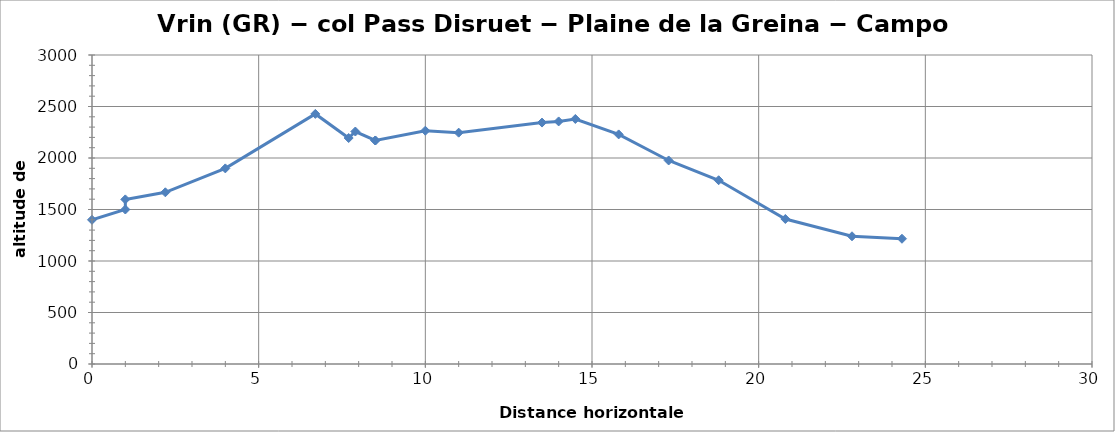
| Category | Vrin (GR) − col Pass Disruet − Plaine de la Greina − Campo (Blenio) |
|---|---|
| 0.0 | 1400 |
| 1.0 | 1500 |
| 1.0 | 1598 |
| 2.2 | 1667 |
| 4.0 | 1899 |
| 6.7 | 2428 |
| 7.7 | 2194 |
| 7.9 | 2257 |
| 8.5 | 2170 |
| 8.5 | 2170 |
| 10.0 | 2265 |
| 11.0 | 2246 |
| 13.5 | 2344 |
| 14.0 | 2355 |
| 14.5 | 2379 |
| 15.8 | 2229 |
| 17.3 | 1976 |
| 18.8 | 1784 |
| 20.8 | 1408 |
| 22.8 | 1240 |
| 24.3 | 1216 |